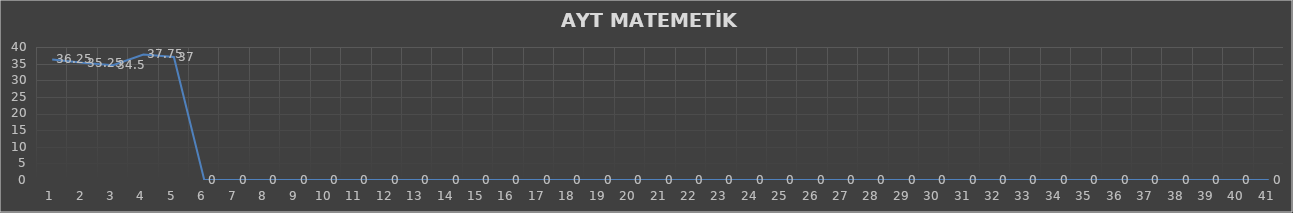
| Category | Series 0 |
|---|---|
| 0 | 36.25 |
| 1 | 35.25 |
| 2 | 34.5 |
| 3 | 37.75 |
| 4 | 37 |
| 5 | 0 |
| 6 | 0 |
| 7 | 0 |
| 8 | 0 |
| 9 | 0 |
| 10 | 0 |
| 11 | 0 |
| 12 | 0 |
| 13 | 0 |
| 14 | 0 |
| 15 | 0 |
| 16 | 0 |
| 17 | 0 |
| 18 | 0 |
| 19 | 0 |
| 20 | 0 |
| 21 | 0 |
| 22 | 0 |
| 23 | 0 |
| 24 | 0 |
| 25 | 0 |
| 26 | 0 |
| 27 | 0 |
| 28 | 0 |
| 29 | 0 |
| 30 | 0 |
| 31 | 0 |
| 32 | 0 |
| 33 | 0 |
| 34 | 0 |
| 35 | 0 |
| 36 | 0 |
| 37 | 0 |
| 38 | 0 |
| 39 | 0 |
| 40 | 0 |